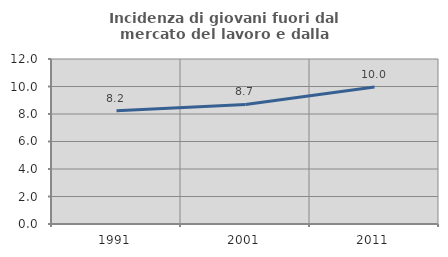
| Category | Incidenza di giovani fuori dal mercato del lavoro e dalla formazione  |
|---|---|
| 1991.0 | 8.242 |
| 2001.0 | 8.692 |
| 2011.0 | 9.963 |